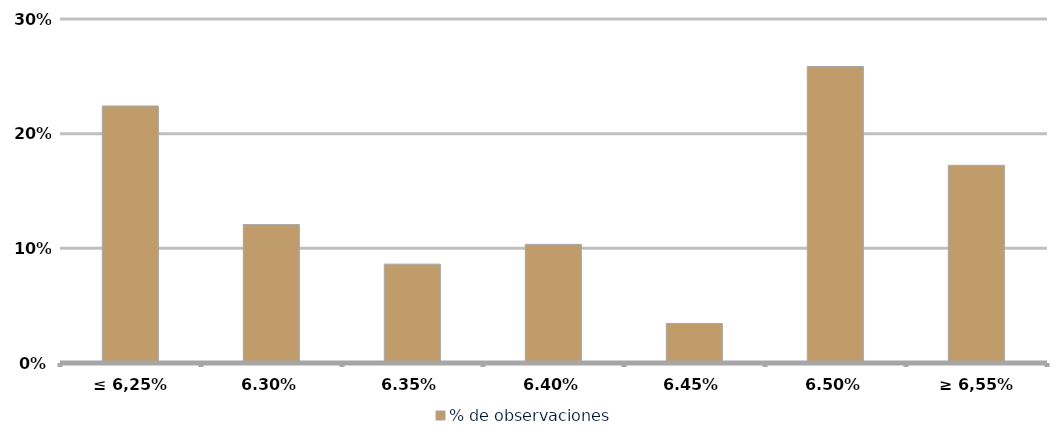
| Category | % de observaciones  |
|---|---|
| ≤ 6,25% | 0.224 |
| 6,30% | 0.121 |
| 6,35% | 0.086 |
| 6,40% | 0.103 |
| 6,45% | 0.034 |
| 6,50% | 0.259 |
| ≥ 6,55% | 0.172 |